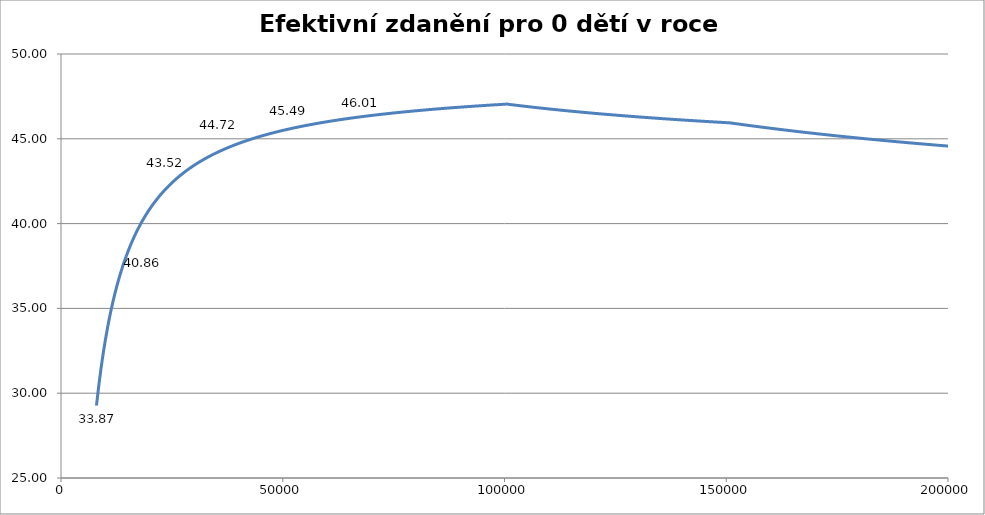
| Category | Efektivní zdanění 2012 |
|---|---|
| 8000.0 | 29.272 |
| 8500.0 | 30.408 |
| 9000.0 | 31.418 |
| 9500.0 | 32.321 |
| 10000.0 | 33.134 |
| 10500.0 | 33.87 |
| 11000.0 | 34.539 |
| 11500.0 | 35.149 |
| 12000.0 | 35.709 |
| 12500.0 | 36.224 |
| 13000.0 | 36.699 |
| 13500.0 | 37.139 |
| 14000.0 | 37.548 |
| 14500.0 | 37.928 |
| 15000.0 | 38.284 |
| 15500.0 | 38.616 |
| 16000.0 | 38.927 |
| 16500.0 | 39.22 |
| 17000.0 | 39.495 |
| 17500.0 | 39.755 |
| 18000.0 | 40 |
| 18500.0 | 40.232 |
| 19000.0 | 40.452 |
| 19500.0 | 40.66 |
| 20000.0 | 40.858 |
| 20500.0 | 41.047 |
| 21000.0 | 41.226 |
| 21500.0 | 41.397 |
| 22000.0 | 41.56 |
| 22500.0 | 41.716 |
| 23000.0 | 41.866 |
| 23500.0 | 42.009 |
| 24000.0 | 42.146 |
| 24500.0 | 42.277 |
| 25000.0 | 42.403 |
| 25500.0 | 42.524 |
| 26000.0 | 42.641 |
| 26500.0 | 42.753 |
| 27000.0 | 42.861 |
| 27500.0 | 42.965 |
| 28000.0 | 43.065 |
| 28500.0 | 43.162 |
| 29000.0 | 43.255 |
| 29500.0 | 43.346 |
| 30000.0 | 43.433 |
| 30500.0 | 43.517 |
| 31000.0 | 43.599 |
| 31500.0 | 43.678 |
| 32000.0 | 43.755 |
| 32500.0 | 43.829 |
| 33000.0 | 43.901 |
| 33500.0 | 43.971 |
| 34000.0 | 44.039 |
| 34500.0 | 44.104 |
| 35000.0 | 44.168 |
| 35500.0 | 44.231 |
| 36000.0 | 44.291 |
| 36500.0 | 44.35 |
| 37000.0 | 44.407 |
| 37500.0 | 44.463 |
| 38000.0 | 44.517 |
| 38500.0 | 44.57 |
| 39000.0 | 44.621 |
| 39500.0 | 44.671 |
| 40000.0 | 44.72 |
| 40500.0 | 44.768 |
| 41000.0 | 44.814 |
| 41500.0 | 44.86 |
| 42000.0 | 44.904 |
| 42500.0 | 44.947 |
| 43000.0 | 44.99 |
| 43500.0 | 45.031 |
| 44000.0 | 45.071 |
| 44500.0 | 45.111 |
| 45000.0 | 45.149 |
| 45500.0 | 45.187 |
| 46000.0 | 45.224 |
| 46500.0 | 45.26 |
| 47000.0 | 45.295 |
| 47500.0 | 45.33 |
| 48000.0 | 45.364 |
| 48500.0 | 45.397 |
| 49000.0 | 45.429 |
| 49500.0 | 45.461 |
| 50000.0 | 45.493 |
| 50500.0 | 45.523 |
| 51000.0 | 45.553 |
| 51500.0 | 45.583 |
| 52000.0 | 45.611 |
| 52500.0 | 45.64 |
| 53000.0 | 45.667 |
| 53500.0 | 45.695 |
| 54000.0 | 45.721 |
| 54500.0 | 45.748 |
| 55000.0 | 45.773 |
| 55500.0 | 45.799 |
| 56000.0 | 45.824 |
| 56500.0 | 45.848 |
| 57000.0 | 45.872 |
| 57500.0 | 45.896 |
| 58000.0 | 45.919 |
| 58500.0 | 45.941 |
| 59000.0 | 45.964 |
| 59500.0 | 45.986 |
| 60000.0 | 46.007 |
| 60500.0 | 46.029 |
| 61000.0 | 46.05 |
| 61500.0 | 46.07 |
| 62000.0 | 46.091 |
| 62500.0 | 46.11 |
| 63000.0 | 46.13 |
| 63500.0 | 46.149 |
| 64000.0 | 46.168 |
| 64500.0 | 46.187 |
| 65000.0 | 46.206 |
| 65500.0 | 46.224 |
| 66000.0 | 46.242 |
| 66500.0 | 46.259 |
| 67000.0 | 46.276 |
| 67500.0 | 46.294 |
| 68000.0 | 46.31 |
| 68500.0 | 46.327 |
| 69000.0 | 46.343 |
| 69500.0 | 46.359 |
| 70000.0 | 46.375 |
| 70500.0 | 46.391 |
| 71000.0 | 46.406 |
| 71500.0 | 46.422 |
| 72000.0 | 46.437 |
| 72500.0 | 46.451 |
| 73000.0 | 46.466 |
| 73500.0 | 46.48 |
| 74000.0 | 46.495 |
| 74500.0 | 46.509 |
| 75000.0 | 46.522 |
| 75500.0 | 46.536 |
| 76000.0 | 46.549 |
| 76500.0 | 46.563 |
| 77000.0 | 46.576 |
| 77500.0 | 46.589 |
| 78000.0 | 46.602 |
| 78500.0 | 46.614 |
| 79000.0 | 46.627 |
| 79500.0 | 46.639 |
| 80000.0 | 46.651 |
| 80500.0 | 46.663 |
| 81000.0 | 46.675 |
| 81500.0 | 46.687 |
| 82000.0 | 46.698 |
| 82500.0 | 46.71 |
| 83000.0 | 46.721 |
| 83500.0 | 46.732 |
| 84000.0 | 46.743 |
| 84500.0 | 46.754 |
| 85000.0 | 46.765 |
| 85500.0 | 46.775 |
| 86000.0 | 46.786 |
| 86500.0 | 46.796 |
| 87000.0 | 46.806 |
| 87500.0 | 46.817 |
| 88000.0 | 46.827 |
| 88500.0 | 46.837 |
| 89000.0 | 46.846 |
| 89500.0 | 46.856 |
| 90000.0 | 46.866 |
| 90500.0 | 46.875 |
| 91000.0 | 46.885 |
| 91500.0 | 46.894 |
| 92000.0 | 46.903 |
| 92500.0 | 46.912 |
| 93000.0 | 46.921 |
| 93500.0 | 46.93 |
| 94000.0 | 46.939 |
| 94500.0 | 46.947 |
| 95000.0 | 46.956 |
| 95500.0 | 46.965 |
| 96000.0 | 46.973 |
| 96500.0 | 46.981 |
| 97000.0 | 46.99 |
| 97500.0 | 46.998 |
| 98000.0 | 47.006 |
| 98500.0 | 47.014 |
| 99000.0 | 47.022 |
| 99500.0 | 47.03 |
| 100000.0 | 47.037 |
| 100500.0 | 47.047 |
| 101000.0 | 47.031 |
| 101500.0 | 47.015 |
| 102000.0 | 46.999 |
| 102500.0 | 46.983 |
| 103000.0 | 46.967 |
| 103500.0 | 46.951 |
| 104000.0 | 46.936 |
| 104500.0 | 46.92 |
| 105000.0 | 46.905 |
| 105500.0 | 46.89 |
| 106000.0 | 46.875 |
| 106500.0 | 46.861 |
| 107000.0 | 46.846 |
| 107500.0 | 46.831 |
| 108000.0 | 46.817 |
| 108500.0 | 46.803 |
| 109000.0 | 46.789 |
| 109500.0 | 46.775 |
| 110000.0 | 46.761 |
| 110500.0 | 46.747 |
| 111000.0 | 46.734 |
| 111500.0 | 46.72 |
| 112000.0 | 46.707 |
| 112500.0 | 46.694 |
| 113000.0 | 46.681 |
| 113500.0 | 46.668 |
| 114000.0 | 46.655 |
| 114500.0 | 46.642 |
| 115000.0 | 46.629 |
| 115500.0 | 46.617 |
| 116000.0 | 46.604 |
| 116500.0 | 46.592 |
| 117000.0 | 46.58 |
| 117500.0 | 46.568 |
| 118000.0 | 46.556 |
| 118500.0 | 46.544 |
| 119000.0 | 46.532 |
| 119500.0 | 46.52 |
| 120000.0 | 46.508 |
| 120500.0 | 46.497 |
| 121000.0 | 46.486 |
| 121500.0 | 46.474 |
| 122000.0 | 46.463 |
| 122500.0 | 46.452 |
| 123000.0 | 46.441 |
| 123500.0 | 46.43 |
| 124000.0 | 46.419 |
| 124500.0 | 46.408 |
| 125000.0 | 46.397 |
| 125500.0 | 46.387 |
| 126000.0 | 46.376 |
| 126500.0 | 46.366 |
| 127000.0 | 46.355 |
| 127500.0 | 46.345 |
| 128000.0 | 46.335 |
| 128500.0 | 46.325 |
| 129000.0 | 46.315 |
| 129500.0 | 46.305 |
| 130000.0 | 46.295 |
| 130500.0 | 46.285 |
| 131000.0 | 46.275 |
| 131500.0 | 46.266 |
| 132000.0 | 46.256 |
| 132500.0 | 46.246 |
| 133000.0 | 46.237 |
| 133500.0 | 46.228 |
| 134000.0 | 46.218 |
| 134500.0 | 46.209 |
| 135000.0 | 46.2 |
| 135500.0 | 46.191 |
| 136000.0 | 46.182 |
| 136500.0 | 46.173 |
| 137000.0 | 46.164 |
| 137500.0 | 46.155 |
| 138000.0 | 46.146 |
| 138500.0 | 46.138 |
| 139000.0 | 46.129 |
| 139500.0 | 46.12 |
| 140000.0 | 46.112 |
| 140500.0 | 46.103 |
| 141000.0 | 46.095 |
| 141500.0 | 46.087 |
| 142000.0 | 46.078 |
| 142500.0 | 46.07 |
| 143000.0 | 46.062 |
| 143500.0 | 46.054 |
| 144000.0 | 46.046 |
| 144500.0 | 46.038 |
| 145000.0 | 46.03 |
| 145500.0 | 46.022 |
| 146000.0 | 46.014 |
| 146500.0 | 46.006 |
| 147000.0 | 45.998 |
| 147500.0 | 45.991 |
| 148000.0 | 45.983 |
| 148500.0 | 45.975 |
| 149000.0 | 45.968 |
| 149500.0 | 45.96 |
| 150000.0 | 45.953 |
| 150500.0 | 45.946 |
| 151000.0 | 45.934 |
| 151500.0 | 45.916 |
| 152000.0 | 45.898 |
| 152500.0 | 45.88 |
| 153000.0 | 45.862 |
| 153500.0 | 45.844 |
| 154000.0 | 45.826 |
| 154500.0 | 45.808 |
| 155000.0 | 45.791 |
| 155500.0 | 45.773 |
| 156000.0 | 45.756 |
| 156500.0 | 45.739 |
| 157000.0 | 45.722 |
| 157500.0 | 45.705 |
| 158000.0 | 45.688 |
| 158500.0 | 45.671 |
| 159000.0 | 45.655 |
| 159500.0 | 45.638 |
| 160000.0 | 45.622 |
| 160500.0 | 45.605 |
| 161000.0 | 45.589 |
| 161500.0 | 45.573 |
| 162000.0 | 45.557 |
| 162500.0 | 45.541 |
| 163000.0 | 45.525 |
| 163500.0 | 45.509 |
| 164000.0 | 45.494 |
| 164500.0 | 45.478 |
| 165000.0 | 45.463 |
| 165500.0 | 45.447 |
| 166000.0 | 45.432 |
| 166500.0 | 45.417 |
| 167000.0 | 45.402 |
| 167500.0 | 45.387 |
| 168000.0 | 45.372 |
| 168500.0 | 45.357 |
| 169000.0 | 45.342 |
| 169500.0 | 45.327 |
| 170000.0 | 45.313 |
| 170500.0 | 45.298 |
| 171000.0 | 45.284 |
| 171500.0 | 45.27 |
| 172000.0 | 45.255 |
| 172500.0 | 45.241 |
| 173000.0 | 45.227 |
| 173500.0 | 45.213 |
| 174000.0 | 45.199 |
| 174500.0 | 45.185 |
| 175000.0 | 45.172 |
| 175500.0 | 45.158 |
| 176000.0 | 45.144 |
| 176500.0 | 45.131 |
| 177000.0 | 45.117 |
| 177500.0 | 45.104 |
| 178000.0 | 45.091 |
| 178500.0 | 45.078 |
| 179000.0 | 45.064 |
| 179500.0 | 45.051 |
| 180000.0 | 45.038 |
| 180500.0 | 45.025 |
| 181000.0 | 45.013 |
| 181500.0 | 45 |
| 182000.0 | 44.987 |
| 182500.0 | 44.974 |
| 183000.0 | 44.962 |
| 183500.0 | 44.949 |
| 184000.0 | 44.937 |
| 184500.0 | 44.925 |
| 185000.0 | 44.912 |
| 185500.0 | 44.9 |
| 186000.0 | 44.888 |
| 186500.0 | 44.876 |
| 187000.0 | 44.864 |
| 187500.0 | 44.852 |
| 188000.0 | 44.84 |
| 188500.0 | 44.828 |
| 189000.0 | 44.816 |
| 189500.0 | 44.805 |
| 190000.0 | 44.793 |
| 190500.0 | 44.781 |
| 191000.0 | 44.77 |
| 191500.0 | 44.758 |
| 192000.0 | 44.747 |
| 192500.0 | 44.735 |
| 193000.0 | 44.724 |
| 193500.0 | 44.713 |
| 194000.0 | 44.702 |
| 194500.0 | 44.691 |
| 195000.0 | 44.68 |
| 195500.0 | 44.669 |
| 196000.0 | 44.658 |
| 196500.0 | 44.647 |
| 197000.0 | 44.636 |
| 197500.0 | 44.625 |
| 198000.0 | 44.614 |
| 198500.0 | 44.604 |
| 199000.0 | 44.593 |
| 199500.0 | 44.582 |
| 200000.0 | 44.572 |